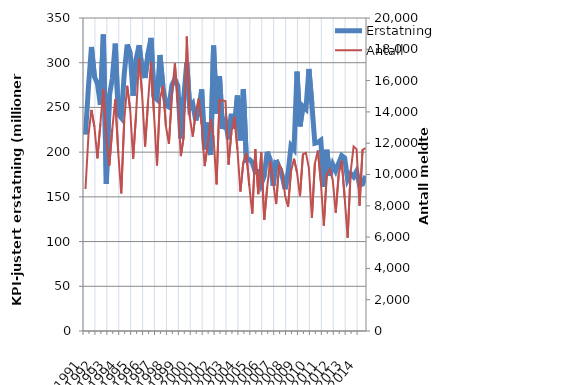
| Category | Erstatning |
|---|---|
| 1991.0 | 219.586 |
| nan | 273.204 |
| nan | 317.524 |
| nan | 284.387 |
| 1992.0 | 276.835 |
| nan | 252.95 |
| nan | 331.491 |
| nan | 164.406 |
| 1993.0 | 262.273 |
| nan | 282.589 |
| nan | 321.28 |
| nan | 242.592 |
| 1994.0 | 238.463 |
| nan | 287.132 |
| nan | 320.273 |
| nan | 310.718 |
| 1995.0 | 263.084 |
| nan | 304.339 |
| nan | 319.599 |
| nan | 292.658 |
| 1996.0 | 282.931 |
| nan | 310.593 |
| nan | 327.701 |
| nan | 261.99 |
| 1997.0 | 259.021 |
| nan | 308.509 |
| nan | 273.07 |
| nan | 252.443 |
| 1998.0 | 250.561 |
| nan | 274.861 |
| nan | 281.847 |
| nan | 274.264 |
| 1999.0 | 215.461 |
| nan | 261.441 |
| nan | 300.465 |
| nan | 249.21 |
| 2000.0 | 254.031 |
| nan | 235.584 |
| nan | 247.117 |
| nan | 270.159 |
| 2001.0 | 203.157 |
| nan | 233.013 |
| nan | 196.769 |
| nan | 319.142 |
| 2002.0 | 242.984 |
| nan | 284.87 |
| nan | 225.911 |
| nan | 234.548 |
| 2003.0 | 214.298 |
| nan | 242.827 |
| nan | 226.425 |
| nan | 263.275 |
| 2004.0 | 213.218 |
| nan | 270.293 |
| nan | 190.968 |
| nan | 191.765 |
| 2005.0 | 188.494 |
| nan | 177.652 |
| nan | 178.389 |
| nan | 164.279 |
| 2006.0 | 173.332 |
| nan | 200.446 |
| nan | 191.175 |
| nan | 162.506 |
| 2007.0 | 191.192 |
| nan | 182.639 |
| nan | 174.187 |
| nan | 158.64 |
| 2008.0 | 176.254 |
| nan | 207.24 |
| nan | 203.099 |
| nan | 290.139 |
| 2009.0 | 228.892 |
| nan | 251.211 |
| nan | 248.067 |
| nan | 292.993 |
| 2010.0 | 253.489 |
| nan | 209.889 |
| nan | 210.751 |
| nan | 213.264 |
| 2011.0 | 161.308 |
| nan | 202.632 |
| nan | 173.506 |
| nan | 186.238 |
| 2012.0 | 179.074 |
| nan | 187.704 |
| nan | 196.168 |
| nan | 193.591 |
| 2013.0 | 169.362 |
| nan | 176.036 |
| nan | 172.418 |
| nan | 178.636 |
| 2014.0 | 163.217 |
| nan | 164.261 |
| nan | 173.414 |